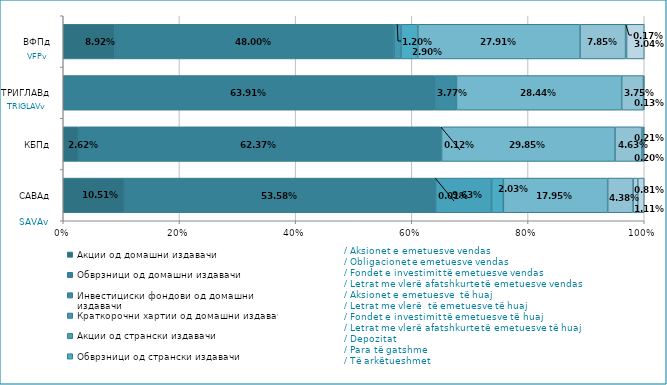
| Category | Акции од домашни издавачи  | Обврзници од домашни издавачи  | Инвестициски фондови од домашни издавачи   | Краткорочни хартии од домашни издавачи   | Акции од странски издавачи   | Обврзници од странски издавачи  | Инвестициски фондови од странски издавaчи  | Краткорочни хартии од странски издавачи  | Депозити | Парични средства | Побарувања |
|---|---|---|---|---|---|---|---|---|---|---|---|
| САВАд | 0.105 | 0.536 | 0 | 0 | 0.096 | 0.02 | 0.18 | 0 | 0.044 | 0.008 | 0.011 |
| КБПд | 0.026 | 0.624 | 0.001 | 0 | 0 | 0 | 0.299 | 0 | 0.046 | 0.002 | 0.002 |
| ТРИГЛАВд | 0 | 0.639 | 0.038 | 0 | 0 | 0 | 0.284 | 0 | 0.038 | 0.001 | 0 |
| ВФПд | 0.089 | 0.48 | 0 | 0.012 | 0 | 0.029 | 0.279 | 0 | 0.078 | 0.002 | 0.03 |